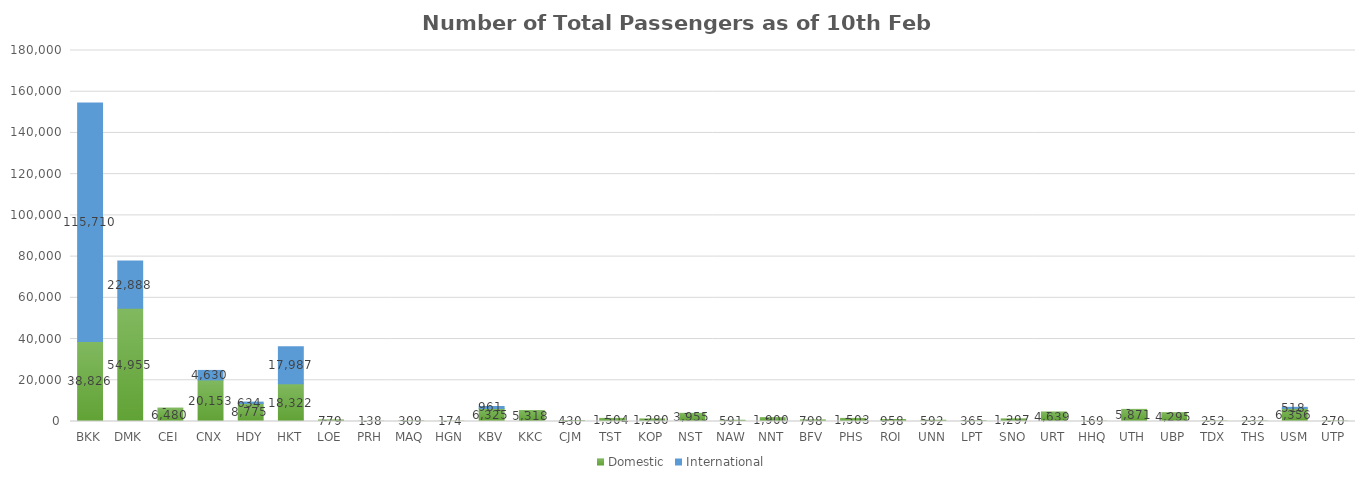
| Category | Domestic | International |
|---|---|---|
| BKK | 38826 | 115710 |
| DMK | 54955 | 22888 |
| CEI | 6480 | 0 |
| CNX | 20153 | 4630 |
| HDY | 8775 | 634 |
| HKT | 18322 | 17987 |
| LOE | 779 | 0 |
| PRH | 138 | 0 |
| MAQ | 309 | 0 |
| HGN | 174 | 0 |
| KBV | 6325 | 961 |
| KKC | 5318 | 0 |
| CJM | 430 | 0 |
| TST | 1504 | 0 |
| KOP | 1280 | 0 |
| NST | 3955 | 0 |
| NAW | 591 | 0 |
| NNT | 1900 | 0 |
| BFV | 798 | 0 |
| PHS | 1503 | 0 |
| ROI | 958 | 0 |
| UNN | 592 | 0 |
| LPT | 365 | 0 |
| SNO | 1297 | 0 |
| URT | 4639 | 0 |
| HHQ | 169 | 0 |
| UTH | 5871 | 0 |
| UBP | 4295 | 0 |
| TDX | 252 | 0 |
| THS | 232 | 0 |
| USM | 6356 | 518 |
| UTP | 270 | 0 |